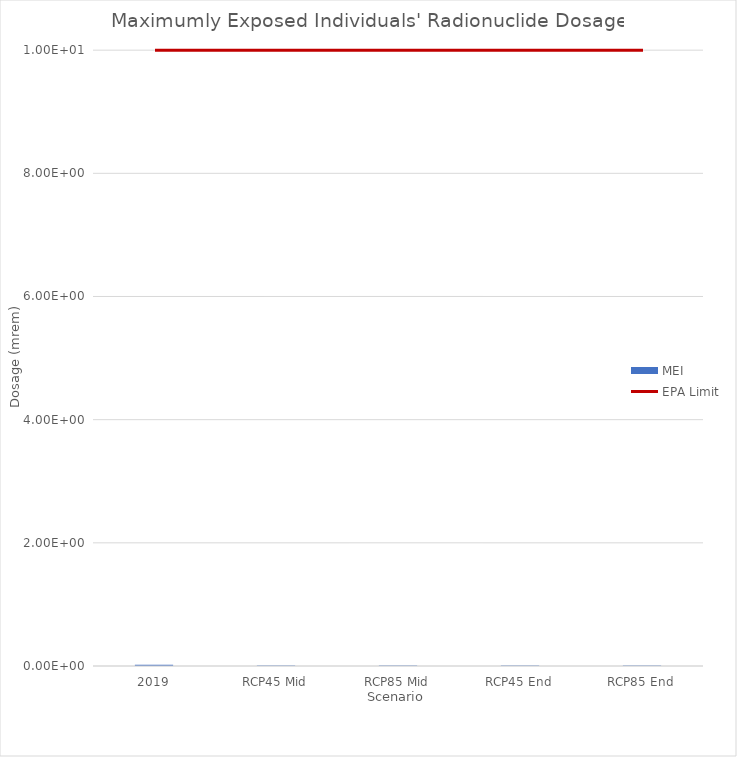
| Category | MEI |
|---|---|
| 2019 | 0.02 |
| RCP45 Mid | 0.01 |
| RCP85 Mid | 0.01 |
| RCP45 End | 0.009 |
| RCP85 End | 0.01 |